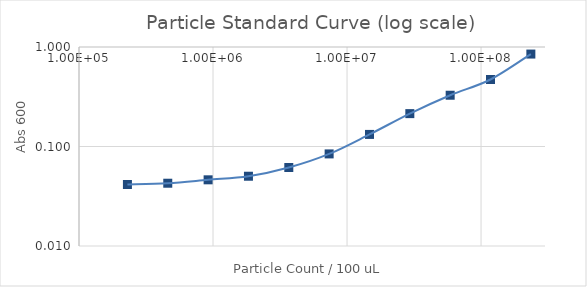
| Category | Series 1 |
|---|---|
| 235294117.64705887 | 0.849 |
| 117647058.82352944 | 0.472 |
| 58823529.41176472 | 0.328 |
| 29411764.70588236 | 0.214 |
| 14705882.35294118 | 0.132 |
| 7352941.17647059 | 0.084 |
| 3676470.588235295 | 0.062 |
| 1838235.2941176475 | 0.05 |
| 919117.6470588237 | 0.046 |
| 459558.82352941186 | 0.043 |
| 229779.41176470593 | 0.042 |